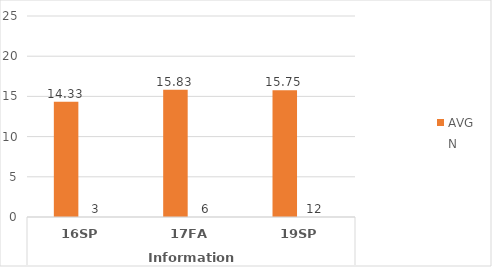
| Category | Human Services - AVG | Human Services - N |
|---|---|---|
| 0 | 14.333 | 3 |
| 1 | 15.833 | 6 |
| 2 | 15.75 | 12 |